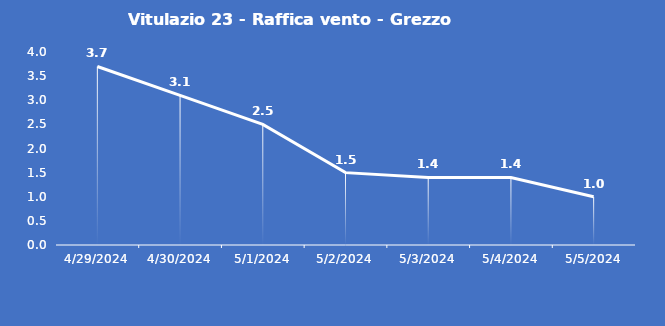
| Category | Vitulazio 23 - Raffica vento - Grezzo (m/s) |
|---|---|
| 4/29/24 | 3.7 |
| 4/30/24 | 3.1 |
| 5/1/24 | 2.5 |
| 5/2/24 | 1.5 |
| 5/3/24 | 1.4 |
| 5/4/24 | 1.4 |
| 5/5/24 | 1 |